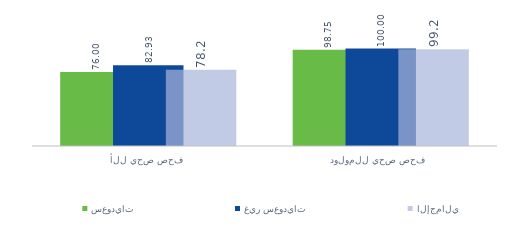
| Category | سعوديات | غير سعوديات | الإجمالي |
|---|---|---|---|
| فحص صحي للأم | 76.004 | 82.931 | 78.247 |
| فحص صحي للمولود | 98.75 | 100 | 99.155 |